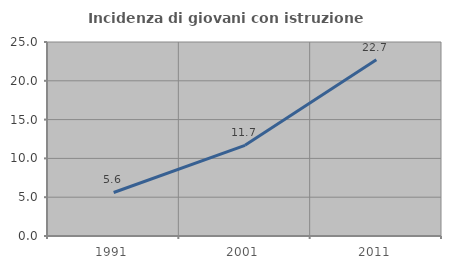
| Category | Incidenza di giovani con istruzione universitaria |
|---|---|
| 1991.0 | 5.607 |
| 2001.0 | 11.688 |
| 2011.0 | 22.727 |